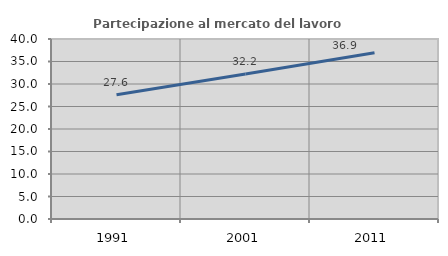
| Category | Partecipazione al mercato del lavoro  femminile |
|---|---|
| 1991.0 | 27.627 |
| 2001.0 | 32.215 |
| 2011.0 | 36.944 |